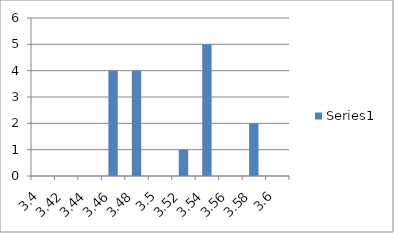
| Category | Series 0 |
|---|---|
| 3.4 | 0 |
| 3.42 | 0 |
| 3.44 | 0 |
| 3.46 | 4 |
| 3.48 | 4 |
| 3.5 | 0 |
| 3.52 | 1 |
| 3.54 | 5 |
| 3.56 | 0 |
| 3.58 | 2 |
| 3.6 | 0 |